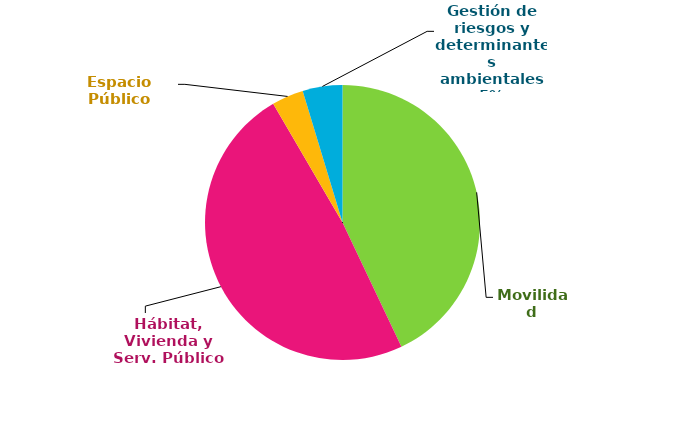
| Category | Privado |
|---|---|
| Movilidad | 1.252 |
| Hábitat, Vivienda y Serv. Público | 1.418 |
| Espacio Público | 0.109 |
| Gestión de riesgos y determinantes ambientales | 0.136 |